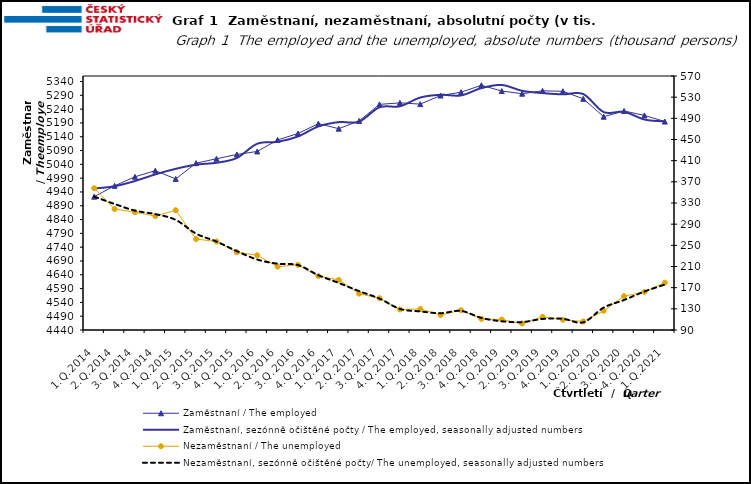
| Category | Zaměstnaní / The employed | Zaměstnaní, sezónně očištěné počty / The employed, seasonally adjusted numbers |
|---|---|---|
| 1.Q.2014 | 4922.963 | 4952.405 |
| 2.Q.2014 | 4962.219 | 4960.65 |
| 3.Q.2014 | 4994.947 | 4979.618 |
| 4.Q.2014 | 5017.051 | 5003.629 |
| 1.Q.2015 | 4987.141 | 5023.827 |
| 2.Q.2015 | 5044.285 | 5038.984 |
| 3.Q.2015 | 5060.3 | 5045.647 |
| 4.Q.2015 | 5075.884 | 5063.085 |
| 1.Q.2016 | 5086.671 | 5114.698 |
| 2.Q.2016 | 5128.493 | 5121.602 |
| 3.Q.2016 | 5151.712 | 5140.967 |
| 4.Q.2016 | 5187.436 | 5177.35 |
| 1.Q.2017 | 5169.203 | 5192.941 |
| 2.Q.2017 | 5197.265 | 5194.555 |
| 3.Q.2017 | 5257.26 | 5246.726 |
| 4.Q.2017 | 5262.691 | 5250.237 |
| 1.Q.2018 | 5258.225 | 5281.99 |
| 2.Q.2018 | 5289.242 | 5291.982 |
| 3.Q.2018 | 5301.361 | 5289.641 |
| 4.Q.2018 | 5326.327 | 5316.128 |
| 1.Q.2019 | 5305.534 | 5327.565 |
| 2.Q.2019 | 5295.929 | 5306.306 |
| 3.Q.2019 | 5306.247 | 5298.103 |
| 4.Q.2019 | 5304.7 | 5293.467 |
| 1.Q.2020 | 5277.418 | 5294.602 |
| 2.Q.2020 | 5212.593 | 5229.332 |
| 3.Q.2020 | 5233.335 | 5230.287 |
| 4.Q.2020 | 5217.23 | 5202.367 |
| 1.Q.2021 | 5195.002 | 5195.401 |